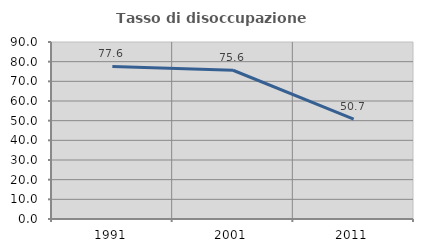
| Category | Tasso di disoccupazione giovanile  |
|---|---|
| 1991.0 | 77.576 |
| 2001.0 | 75.636 |
| 2011.0 | 50.739 |